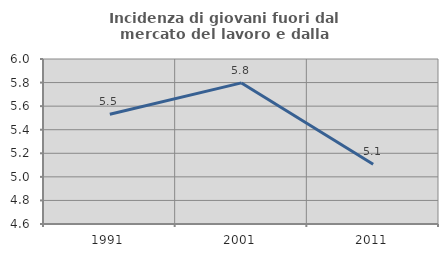
| Category | Incidenza di giovani fuori dal mercato del lavoro e dalla formazione  |
|---|---|
| 1991.0 | 5.532 |
| 2001.0 | 5.797 |
| 2011.0 | 5.106 |